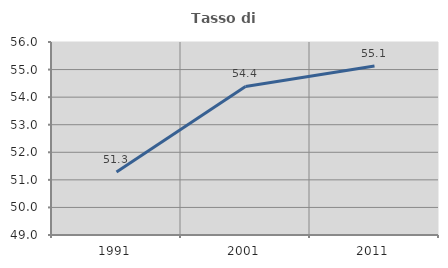
| Category | Tasso di occupazione   |
|---|---|
| 1991.0 | 51.286 |
| 2001.0 | 54.388 |
| 2011.0 | 55.128 |